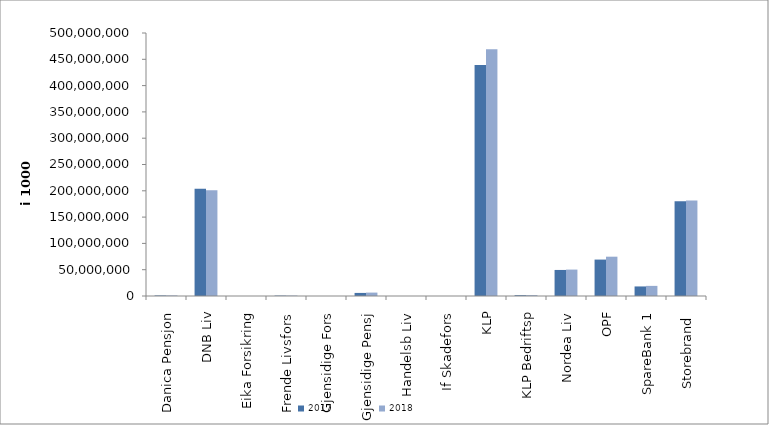
| Category | 2017 | 2018 |
|---|---|---|
| Danica Pensjon | 1007145.416 | 1087595.622 |
| DNB Liv | 203732853 | 201016641 |
| Eika Forsikring | 0 | 0 |
| Frende Livsfors | 771494 | 833959.8 |
| Gjensidige Fors | 0 | 0 |
| Gjensidige Pensj | 5849818.078 | 6474253 |
| Handelsb Liv | 24751 | 22959 |
| If Skadefors | 0 | 0 |
| KLP | 439040297.388 | 469261417.093 |
| KLP Bedriftsp | 1539670 | 1682836 |
| Nordea Liv | 49518955.083 | 50214570 |
| OPF | 69246198 | 74741399.904 |
| SpareBank 1 | 18169216.951 | 19235566.757 |
| Storebrand  | 179943354.952 | 181362430.314 |